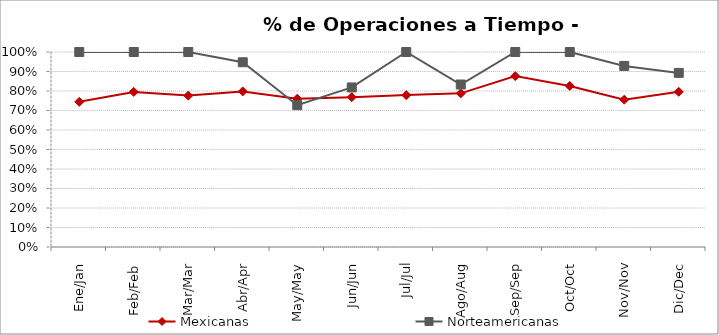
| Category | Mexicanas | Norteamericanas |
|---|---|---|
| Ene/Jan | 0.744 | 1 |
| Feb/Feb | 0.795 | 1 |
| Mar/Mar | 0.776 | 1 |
| Abr/Apr | 0.798 | 0.947 |
| May/May | 0.76 | 0.727 |
| Jun/Jun | 0.768 | 0.818 |
| Jul/Jul | 0.779 | 1 |
| Ago/Aug | 0.788 | 0.833 |
| Sep/Sep | 0.876 | 1 |
| Oct/Oct | 0.826 | 1 |
| Nov/Nov | 0.755 | 0.929 |
| Dic/Dec | 0.796 | 0.893 |